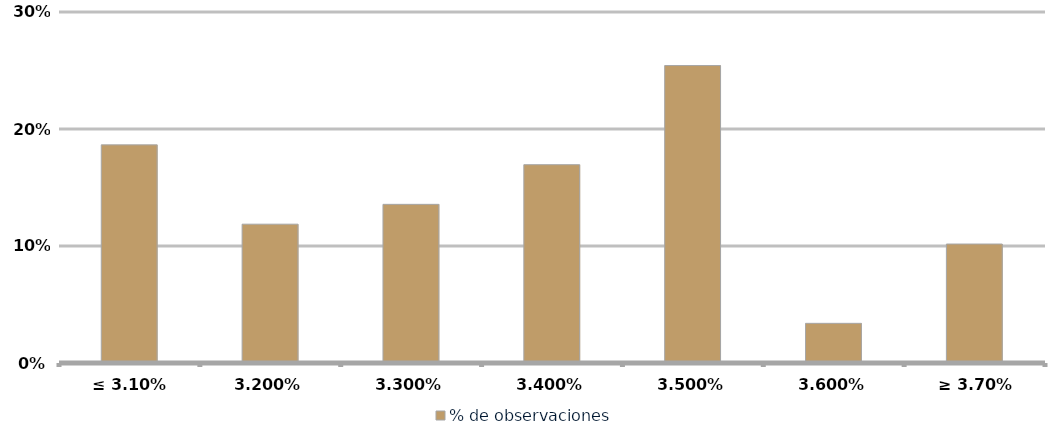
| Category | % de observaciones  |
|---|---|
| ≤ 3.10% | 0.186 |
| 3.20% | 0.119 |
| 3.30% | 0.136 |
| 3.40% | 0.169 |
| 3.50% | 0.254 |
| 3.60% | 0.034 |
| ≥ 3.70% | 0.102 |